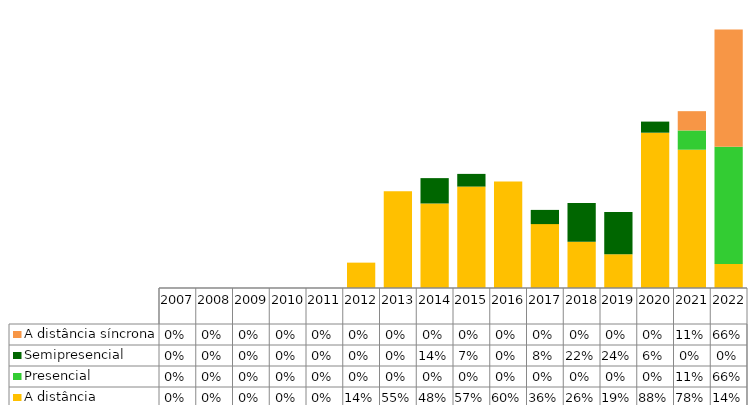
| Category | A distância | Presencial | Semipresencial | A distância síncrona |
|---|---|---|---|---|
| 2007.0 | 0 | 0 | 0 | 0 |
| 2008.0 | 0 | 0 | 0 | 0 |
| 2009.0 | 0 | 0 | 0 | 0 |
| 2010.0 | 0 | 0 | 0 | 0 |
| 2011.0 | 0 | 0 | 0 | 0 |
| 2012.0 | 0.143 | 0 | 0 | 0 |
| 2013.0 | 0.545 | 0 | 0 | 0 |
| 2014.0 | 0.476 | 0 | 0.143 | 0 |
| 2015.0 | 0.571 | 0 | 0.071 | 0 |
| 2016.0 | 0.6 | 0 | 0 | 0 |
| 2017.0 | 0.36 | 0 | 0.08 | 0 |
| 2018.0 | 0.261 | 0 | 0.217 | 0 |
| 2019.0 | 0.19 | 0 | 0.238 | 0 |
| 2020.0 | 0.875 | 0 | 0.062 | 0 |
| 2021.0 | 0.779 | 0.109 | 0 | 0.109 |
| 2022.0 | 0.136 | 0.661 | 0 | 0.661 |